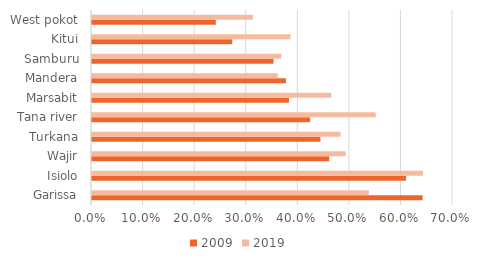
| Category | 2009 | 2019 |
|---|---|---|
| Garissa | 0.641 | 0.537 |
| Isiolo | 0.609 | 0.642 |
| Wajir | 0.46 | 0.492 |
| Turkana | 0.443 | 0.482 |
| Tana river | 0.423 | 0.55 |
| Marsabit | 0.382 | 0.464 |
| Mandera | 0.376 | 0.36 |
| Samburu | 0.352 | 0.367 |
| Kitui | 0.272 | 0.385 |
| West pokot | 0.24 | 0.312 |